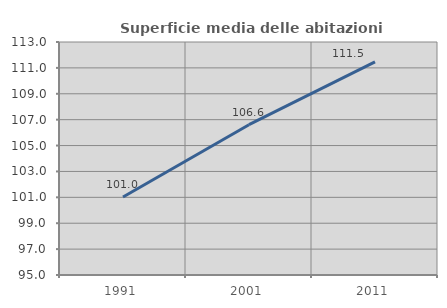
| Category | Superficie media delle abitazioni occupate |
|---|---|
| 1991.0 | 101.026 |
| 2001.0 | 106.612 |
| 2011.0 | 111.468 |